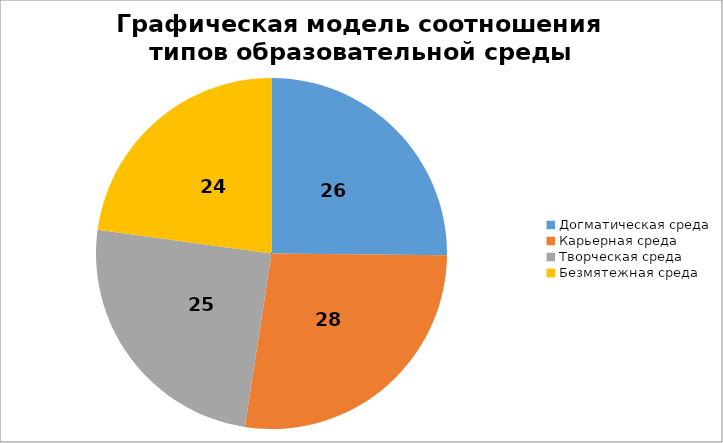
| Category | Графическая модель соотношения типов образовательной среды |
|---|---|
| Догматическая среда | 25.92 |
| Карьерная среда | 28.08 |
| Творческая среда | 25.48 |
| Безмятежная среда | 23.52 |